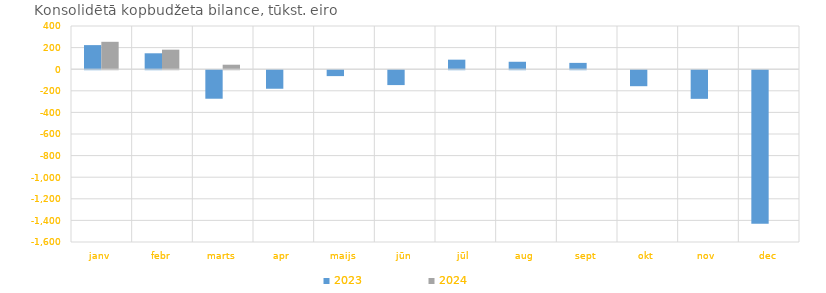
| Category | 2023 | 2024 |
|---|---|---|
| janv | 223039.368 | 253732.151 |
| febr | 147311.843 | 180870.996 |
| marts | -264068.626 | 41575.774 |
| apr | -171713.076 | 0 |
| maijs | -54726.191 | 0 |
| jūn | -137743.262 | 0 |
| jūl | 88248.137 | 0 |
| aug | 68812.633 | 0 |
| sept | 58478.143 | 0 |
| okt | -148160.348 | 0 |
| nov | -265174.749 | 0 |
| dec | -1422913.79 | 0 |